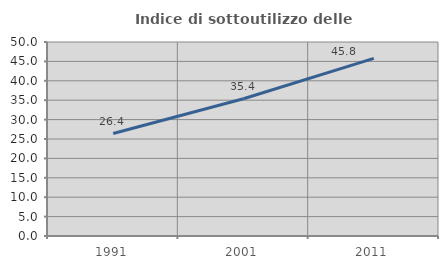
| Category | Indice di sottoutilizzo delle abitazioni  |
|---|---|
| 1991.0 | 26.402 |
| 2001.0 | 35.388 |
| 2011.0 | 45.772 |